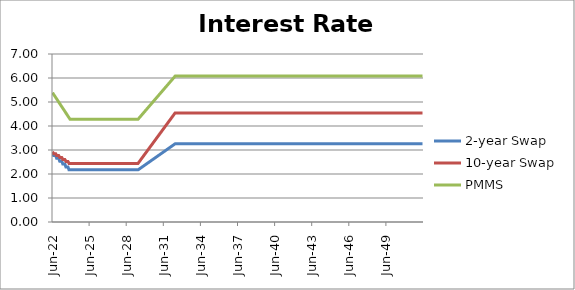
| Category | 2-year Swap | 10-year Swap | PMMS |
|---|---|---|---|
| 2022-06-30 | 2.894 | 2.93 | 5.39 |
| 2022-07-31 | 2.774 | 2.849 | 5.325 |
| 2022-08-31 | 2.774 | 2.849 | 5.259 |
| 2022-09-30 | 2.774 | 2.849 | 5.194 |
| 2022-10-31 | 2.653 | 2.767 | 5.129 |
| 2022-11-30 | 2.653 | 2.767 | 5.064 |
| 2022-12-31 | 2.653 | 2.767 | 4.999 |
| 2023-01-31 | 2.533 | 2.686 | 4.934 |
| 2023-02-28 | 2.533 | 2.686 | 4.868 |
| 2023-03-31 | 2.533 | 2.686 | 4.803 |
| 2023-04-30 | 2.413 | 2.605 | 4.738 |
| 2023-05-31 | 2.413 | 2.605 | 4.673 |
| 2023-06-30 | 2.413 | 2.605 | 4.608 |
| 2023-07-31 | 2.293 | 2.523 | 4.542 |
| 2023-08-31 | 2.293 | 2.523 | 4.477 |
| 2023-09-30 | 2.293 | 2.523 | 4.412 |
| 2023-10-31 | 2.172 | 2.442 | 4.347 |
| 2023-11-30 | 2.172 | 2.442 | 4.282 |
| 2023-12-31 | 2.172 | 2.442 | 4.282 |
| 2024-01-31 | 2.172 | 2.442 | 4.282 |
| 2024-02-29 | 2.172 | 2.442 | 4.282 |
| 2024-03-31 | 2.172 | 2.442 | 4.282 |
| 2024-04-30 | 2.172 | 2.442 | 4.282 |
| 2024-05-31 | 2.172 | 2.442 | 4.282 |
| 2024-06-30 | 2.172 | 2.442 | 4.282 |
| 2024-07-31 | 2.172 | 2.442 | 4.282 |
| 2024-08-31 | 2.172 | 2.442 | 4.282 |
| 2024-09-30 | 2.172 | 2.442 | 4.282 |
| 2024-10-31 | 2.172 | 2.442 | 4.282 |
| 2024-11-30 | 2.172 | 2.442 | 4.282 |
| 2024-12-31 | 2.172 | 2.442 | 4.282 |
| 2025-01-31 | 2.172 | 2.442 | 4.282 |
| 2025-02-28 | 2.172 | 2.442 | 4.282 |
| 2025-03-31 | 2.172 | 2.442 | 4.282 |
| 2025-04-30 | 2.172 | 2.442 | 4.282 |
| 2025-05-31 | 2.172 | 2.442 | 4.282 |
| 2025-06-30 | 2.172 | 2.442 | 4.282 |
| 2025-07-31 | 2.172 | 2.442 | 4.282 |
| 2025-08-31 | 2.172 | 2.442 | 4.282 |
| 2025-09-30 | 2.172 | 2.442 | 4.282 |
| 2025-10-31 | 2.172 | 2.442 | 4.282 |
| 2025-11-30 | 2.172 | 2.442 | 4.282 |
| 2025-12-31 | 2.172 | 2.442 | 4.282 |
| 2026-01-31 | 2.172 | 2.442 | 4.282 |
| 2026-02-28 | 2.172 | 2.442 | 4.282 |
| 2026-03-31 | 2.172 | 2.442 | 4.282 |
| 2026-04-30 | 2.172 | 2.442 | 4.282 |
| 2026-05-31 | 2.172 | 2.442 | 4.282 |
| 2026-06-30 | 2.172 | 2.442 | 4.282 |
| 2026-07-31 | 2.172 | 2.442 | 4.282 |
| 2026-08-31 | 2.172 | 2.442 | 4.282 |
| 2026-09-30 | 2.172 | 2.442 | 4.282 |
| 2026-10-31 | 2.172 | 2.442 | 4.282 |
| 2026-11-30 | 2.172 | 2.442 | 4.282 |
| 2026-12-31 | 2.172 | 2.442 | 4.282 |
| 2027-01-31 | 2.172 | 2.442 | 4.282 |
| 2027-02-28 | 2.172 | 2.442 | 4.282 |
| 2027-03-31 | 2.172 | 2.442 | 4.282 |
| 2027-04-30 | 2.172 | 2.442 | 4.282 |
| 2027-05-31 | 2.172 | 2.442 | 4.282 |
| 2027-06-30 | 2.172 | 2.442 | 4.282 |
| 2027-07-31 | 2.172 | 2.442 | 4.282 |
| 2027-08-31 | 2.172 | 2.442 | 4.282 |
| 2027-09-30 | 2.172 | 2.442 | 4.282 |
| 2027-10-31 | 2.172 | 2.442 | 4.282 |
| 2027-11-30 | 2.172 | 2.442 | 4.282 |
| 2027-12-31 | 2.172 | 2.442 | 4.282 |
| 2028-01-31 | 2.172 | 2.442 | 4.282 |
| 2028-02-29 | 2.172 | 2.442 | 4.282 |
| 2028-03-31 | 2.172 | 2.442 | 4.282 |
| 2028-04-30 | 2.172 | 2.442 | 4.282 |
| 2028-05-31 | 2.172 | 2.442 | 4.282 |
| 2028-06-30 | 2.172 | 2.442 | 4.282 |
| 2028-07-31 | 2.172 | 2.442 | 4.282 |
| 2028-08-31 | 2.172 | 2.442 | 4.282 |
| 2028-09-30 | 2.172 | 2.442 | 4.282 |
| 2028-10-31 | 2.172 | 2.442 | 4.282 |
| 2028-11-30 | 2.172 | 2.442 | 4.282 |
| 2028-12-31 | 2.172 | 2.442 | 4.282 |
| 2029-01-31 | 2.172 | 2.442 | 4.282 |
| 2029-02-28 | 2.172 | 2.442 | 4.282 |
| 2029-03-31 | 2.172 | 2.442 | 4.282 |
| 2029-04-30 | 2.172 | 2.442 | 4.282 |
| 2029-05-31 | 2.172 | 2.442 | 4.282 |
| 2029-06-30 | 2.203 | 2.5 | 4.332 |
| 2029-07-31 | 2.233 | 2.559 | 4.382 |
| 2029-08-31 | 2.263 | 2.617 | 4.431 |
| 2029-09-30 | 2.293 | 2.676 | 4.481 |
| 2029-10-31 | 2.323 | 2.734 | 4.531 |
| 2029-11-30 | 2.354 | 2.793 | 4.581 |
| 2029-12-31 | 2.384 | 2.851 | 4.631 |
| 2030-01-31 | 2.414 | 2.91 | 4.681 |
| 2030-02-28 | 2.444 | 2.968 | 4.731 |
| 2030-03-31 | 2.474 | 3.026 | 4.781 |
| 2030-04-30 | 2.505 | 3.085 | 4.831 |
| 2030-05-31 | 2.535 | 3.143 | 4.881 |
| 2030-06-30 | 2.565 | 3.202 | 4.931 |
| 2030-07-31 | 2.595 | 3.26 | 4.981 |
| 2030-08-31 | 2.625 | 3.319 | 5.031 |
| 2030-09-30 | 2.655 | 3.377 | 5.081 |
| 2030-10-31 | 2.686 | 3.436 | 5.13 |
| 2030-11-30 | 2.716 | 3.494 | 5.18 |
| 2030-12-31 | 2.746 | 3.552 | 5.23 |
| 2031-01-31 | 2.776 | 3.611 | 5.28 |
| 2031-02-28 | 2.806 | 3.669 | 5.33 |
| 2031-03-31 | 2.837 | 3.728 | 5.38 |
| 2031-04-30 | 2.867 | 3.786 | 5.43 |
| 2031-05-31 | 2.897 | 3.845 | 5.48 |
| 2031-06-30 | 2.927 | 3.903 | 5.53 |
| 2031-07-31 | 2.957 | 3.962 | 5.58 |
| 2031-08-31 | 2.988 | 4.02 | 5.63 |
| 2031-09-30 | 3.018 | 4.078 | 5.68 |
| 2031-10-31 | 3.048 | 4.137 | 5.73 |
| 2031-11-30 | 3.078 | 4.195 | 5.779 |
| 2031-12-31 | 3.108 | 4.254 | 5.829 |
| 2032-01-31 | 3.139 | 4.312 | 5.879 |
| 2032-02-29 | 3.169 | 4.371 | 5.929 |
| 2032-03-31 | 3.199 | 4.429 | 5.979 |
| 2032-04-30 | 3.229 | 4.488 | 6.029 |
| 2032-05-31 | 3.259 | 4.546 | 6.079 |
| 2032-06-30 | 3.259 | 4.546 | 6.079 |
| 2032-07-31 | 3.259 | 4.546 | 6.079 |
| 2032-08-31 | 3.259 | 4.546 | 6.079 |
| 2032-09-30 | 3.259 | 4.546 | 6.079 |
| 2032-10-31 | 3.259 | 4.546 | 6.079 |
| 2032-11-30 | 3.259 | 4.546 | 6.079 |
| 2032-12-31 | 3.259 | 4.546 | 6.079 |
| 2033-01-31 | 3.259 | 4.546 | 6.079 |
| 2033-02-28 | 3.259 | 4.546 | 6.079 |
| 2033-03-31 | 3.259 | 4.546 | 6.079 |
| 2033-04-30 | 3.259 | 4.546 | 6.079 |
| 2033-05-31 | 3.259 | 4.546 | 6.079 |
| 2033-06-30 | 3.259 | 4.546 | 6.079 |
| 2033-07-31 | 3.259 | 4.546 | 6.079 |
| 2033-08-31 | 3.259 | 4.546 | 6.079 |
| 2033-09-30 | 3.259 | 4.546 | 6.079 |
| 2033-10-31 | 3.259 | 4.546 | 6.079 |
| 2033-11-30 | 3.259 | 4.546 | 6.079 |
| 2033-12-31 | 3.259 | 4.546 | 6.079 |
| 2034-01-31 | 3.259 | 4.546 | 6.079 |
| 2034-02-28 | 3.259 | 4.546 | 6.079 |
| 2034-03-31 | 3.259 | 4.546 | 6.079 |
| 2034-04-30 | 3.259 | 4.546 | 6.079 |
| 2034-05-31 | 3.259 | 4.546 | 6.079 |
| 2034-06-30 | 3.259 | 4.546 | 6.079 |
| 2034-07-31 | 3.259 | 4.546 | 6.079 |
| 2034-08-31 | 3.259 | 4.546 | 6.079 |
| 2034-09-30 | 3.259 | 4.546 | 6.079 |
| 2034-10-31 | 3.259 | 4.546 | 6.079 |
| 2034-11-30 | 3.259 | 4.546 | 6.079 |
| 2034-12-31 | 3.259 | 4.546 | 6.079 |
| 2035-01-31 | 3.259 | 4.546 | 6.079 |
| 2035-02-28 | 3.259 | 4.546 | 6.079 |
| 2035-03-31 | 3.259 | 4.546 | 6.079 |
| 2035-04-30 | 3.259 | 4.546 | 6.079 |
| 2035-05-31 | 3.259 | 4.546 | 6.079 |
| 2035-06-30 | 3.259 | 4.546 | 6.079 |
| 2035-07-31 | 3.259 | 4.546 | 6.079 |
| 2035-08-31 | 3.259 | 4.546 | 6.079 |
| 2035-09-30 | 3.259 | 4.546 | 6.079 |
| 2035-10-31 | 3.259 | 4.546 | 6.079 |
| 2035-11-30 | 3.259 | 4.546 | 6.079 |
| 2035-12-31 | 3.259 | 4.546 | 6.079 |
| 2036-01-31 | 3.259 | 4.546 | 6.079 |
| 2036-02-29 | 3.259 | 4.546 | 6.079 |
| 2036-03-31 | 3.259 | 4.546 | 6.079 |
| 2036-04-30 | 3.259 | 4.546 | 6.079 |
| 2036-05-31 | 3.259 | 4.546 | 6.079 |
| 2036-06-30 | 3.259 | 4.546 | 6.079 |
| 2036-07-31 | 3.259 | 4.546 | 6.079 |
| 2036-08-31 | 3.259 | 4.546 | 6.079 |
| 2036-09-30 | 3.259 | 4.546 | 6.079 |
| 2036-10-31 | 3.259 | 4.546 | 6.079 |
| 2036-11-30 | 3.259 | 4.546 | 6.079 |
| 2036-12-31 | 3.259 | 4.546 | 6.079 |
| 2037-01-31 | 3.259 | 4.546 | 6.079 |
| 2037-02-28 | 3.259 | 4.546 | 6.079 |
| 2037-03-31 | 3.259 | 4.546 | 6.079 |
| 2037-04-30 | 3.259 | 4.546 | 6.079 |
| 2037-05-31 | 3.259 | 4.546 | 6.079 |
| 2037-06-30 | 3.259 | 4.546 | 6.079 |
| 2037-07-31 | 3.259 | 4.546 | 6.079 |
| 2037-08-31 | 3.259 | 4.546 | 6.079 |
| 2037-09-30 | 3.259 | 4.546 | 6.079 |
| 2037-10-31 | 3.259 | 4.546 | 6.079 |
| 2037-11-30 | 3.259 | 4.546 | 6.079 |
| 2037-12-31 | 3.259 | 4.546 | 6.079 |
| 2038-01-31 | 3.259 | 4.546 | 6.079 |
| 2038-02-28 | 3.259 | 4.546 | 6.079 |
| 2038-03-31 | 3.259 | 4.546 | 6.079 |
| 2038-04-30 | 3.259 | 4.546 | 6.079 |
| 2038-05-31 | 3.259 | 4.546 | 6.079 |
| 2038-06-30 | 3.259 | 4.546 | 6.079 |
| 2038-07-31 | 3.259 | 4.546 | 6.079 |
| 2038-08-31 | 3.259 | 4.546 | 6.079 |
| 2038-09-30 | 3.259 | 4.546 | 6.079 |
| 2038-10-31 | 3.259 | 4.546 | 6.079 |
| 2038-11-30 | 3.259 | 4.546 | 6.079 |
| 2038-12-31 | 3.259 | 4.546 | 6.079 |
| 2039-01-31 | 3.259 | 4.546 | 6.079 |
| 2039-02-28 | 3.259 | 4.546 | 6.079 |
| 2039-03-31 | 3.259 | 4.546 | 6.079 |
| 2039-04-30 | 3.259 | 4.546 | 6.079 |
| 2039-05-31 | 3.259 | 4.546 | 6.079 |
| 2039-06-30 | 3.259 | 4.546 | 6.079 |
| 2039-07-31 | 3.259 | 4.546 | 6.079 |
| 2039-08-31 | 3.259 | 4.546 | 6.079 |
| 2039-09-30 | 3.259 | 4.546 | 6.079 |
| 2039-10-31 | 3.259 | 4.546 | 6.079 |
| 2039-11-30 | 3.259 | 4.546 | 6.079 |
| 2039-12-31 | 3.259 | 4.546 | 6.079 |
| 2040-01-31 | 3.259 | 4.546 | 6.079 |
| 2040-02-29 | 3.259 | 4.546 | 6.079 |
| 2040-03-31 | 3.259 | 4.546 | 6.079 |
| 2040-04-30 | 3.259 | 4.546 | 6.079 |
| 2040-05-31 | 3.259 | 4.546 | 6.079 |
| 2040-06-30 | 3.259 | 4.546 | 6.079 |
| 2040-07-31 | 3.259 | 4.546 | 6.079 |
| 2040-08-31 | 3.259 | 4.546 | 6.079 |
| 2040-09-30 | 3.259 | 4.546 | 6.079 |
| 2040-10-31 | 3.259 | 4.546 | 6.079 |
| 2040-11-30 | 3.259 | 4.546 | 6.079 |
| 2040-12-31 | 3.259 | 4.546 | 6.079 |
| 2041-01-31 | 3.259 | 4.546 | 6.079 |
| 2041-02-28 | 3.259 | 4.546 | 6.079 |
| 2041-03-31 | 3.259 | 4.546 | 6.079 |
| 2041-04-30 | 3.259 | 4.546 | 6.079 |
| 2041-05-31 | 3.259 | 4.546 | 6.079 |
| 2041-06-30 | 3.259 | 4.546 | 6.079 |
| 2041-07-31 | 3.259 | 4.546 | 6.079 |
| 2041-08-31 | 3.259 | 4.546 | 6.079 |
| 2041-09-30 | 3.259 | 4.546 | 6.079 |
| 2041-10-31 | 3.259 | 4.546 | 6.079 |
| 2041-11-30 | 3.259 | 4.546 | 6.079 |
| 2041-12-31 | 3.259 | 4.546 | 6.079 |
| 2042-01-31 | 3.259 | 4.546 | 6.079 |
| 2042-02-28 | 3.259 | 4.546 | 6.079 |
| 2042-03-31 | 3.259 | 4.546 | 6.079 |
| 2042-04-30 | 3.259 | 4.546 | 6.079 |
| 2042-05-31 | 3.259 | 4.546 | 6.079 |
| 2042-06-30 | 3.259 | 4.546 | 6.079 |
| 2042-07-31 | 3.259 | 4.546 | 6.079 |
| 2042-08-31 | 3.259 | 4.546 | 6.079 |
| 2042-09-30 | 3.259 | 4.546 | 6.079 |
| 2042-10-31 | 3.259 | 4.546 | 6.079 |
| 2042-11-30 | 3.259 | 4.546 | 6.079 |
| 2042-12-31 | 3.259 | 4.546 | 6.079 |
| 2043-01-31 | 3.259 | 4.546 | 6.079 |
| 2043-02-28 | 3.259 | 4.546 | 6.079 |
| 2043-03-31 | 3.259 | 4.546 | 6.079 |
| 2043-04-30 | 3.259 | 4.546 | 6.079 |
| 2043-05-31 | 3.259 | 4.546 | 6.079 |
| 2043-06-30 | 3.259 | 4.546 | 6.079 |
| 2043-07-31 | 3.259 | 4.546 | 6.079 |
| 2043-08-31 | 3.259 | 4.546 | 6.079 |
| 2043-09-30 | 3.259 | 4.546 | 6.079 |
| 2043-10-31 | 3.259 | 4.546 | 6.079 |
| 2043-11-30 | 3.259 | 4.546 | 6.079 |
| 2043-12-31 | 3.259 | 4.546 | 6.079 |
| 2044-01-31 | 3.259 | 4.546 | 6.079 |
| 2044-02-29 | 3.259 | 4.546 | 6.079 |
| 2044-03-31 | 3.259 | 4.546 | 6.079 |
| 2044-04-30 | 3.259 | 4.546 | 6.079 |
| 2044-05-31 | 3.259 | 4.546 | 6.079 |
| 2044-06-30 | 3.259 | 4.546 | 6.079 |
| 2044-07-31 | 3.259 | 4.546 | 6.079 |
| 2044-08-31 | 3.259 | 4.546 | 6.079 |
| 2044-09-30 | 3.259 | 4.546 | 6.079 |
| 2044-10-31 | 3.259 | 4.546 | 6.079 |
| 2044-11-30 | 3.259 | 4.546 | 6.079 |
| 2044-12-31 | 3.259 | 4.546 | 6.079 |
| 2045-01-31 | 3.259 | 4.546 | 6.079 |
| 2045-02-28 | 3.259 | 4.546 | 6.079 |
| 2045-03-31 | 3.259 | 4.546 | 6.079 |
| 2045-04-30 | 3.259 | 4.546 | 6.079 |
| 2045-05-31 | 3.259 | 4.546 | 6.079 |
| 2045-06-30 | 3.259 | 4.546 | 6.079 |
| 2045-07-31 | 3.259 | 4.546 | 6.079 |
| 2045-08-31 | 3.259 | 4.546 | 6.079 |
| 2045-09-30 | 3.259 | 4.546 | 6.079 |
| 2045-10-31 | 3.259 | 4.546 | 6.079 |
| 2045-11-30 | 3.259 | 4.546 | 6.079 |
| 2045-12-31 | 3.259 | 4.546 | 6.079 |
| 2046-01-31 | 3.259 | 4.546 | 6.079 |
| 2046-02-28 | 3.259 | 4.546 | 6.079 |
| 2046-03-31 | 3.259 | 4.546 | 6.079 |
| 2046-04-30 | 3.259 | 4.546 | 6.079 |
| 2046-05-31 | 3.259 | 4.546 | 6.079 |
| 2046-06-30 | 3.259 | 4.546 | 6.079 |
| 2046-07-31 | 3.259 | 4.546 | 6.079 |
| 2046-08-31 | 3.259 | 4.546 | 6.079 |
| 2046-09-30 | 3.259 | 4.546 | 6.079 |
| 2046-10-31 | 3.259 | 4.546 | 6.079 |
| 2046-11-30 | 3.259 | 4.546 | 6.079 |
| 2046-12-31 | 3.259 | 4.546 | 6.079 |
| 2047-01-31 | 3.259 | 4.546 | 6.079 |
| 2047-02-28 | 3.259 | 4.546 | 6.079 |
| 2047-03-31 | 3.259 | 4.546 | 6.079 |
| 2047-04-30 | 3.259 | 4.546 | 6.079 |
| 2047-05-31 | 3.259 | 4.546 | 6.079 |
| 2047-06-30 | 3.259 | 4.546 | 6.079 |
| 2047-07-31 | 3.259 | 4.546 | 6.079 |
| 2047-08-31 | 3.259 | 4.546 | 6.079 |
| 2047-09-30 | 3.259 | 4.546 | 6.079 |
| 2047-10-31 | 3.259 | 4.546 | 6.079 |
| 2047-11-30 | 3.259 | 4.546 | 6.079 |
| 2047-12-31 | 3.259 | 4.546 | 6.079 |
| 2048-01-31 | 3.259 | 4.546 | 6.079 |
| 2048-02-29 | 3.259 | 4.546 | 6.079 |
| 2048-03-31 | 3.259 | 4.546 | 6.079 |
| 2048-04-30 | 3.259 | 4.546 | 6.079 |
| 2048-05-31 | 3.259 | 4.546 | 6.079 |
| 2048-06-30 | 3.259 | 4.546 | 6.079 |
| 2048-07-31 | 3.259 | 4.546 | 6.079 |
| 2048-08-31 | 3.259 | 4.546 | 6.079 |
| 2048-09-30 | 3.259 | 4.546 | 6.079 |
| 2048-10-31 | 3.259 | 4.546 | 6.079 |
| 2048-11-30 | 3.259 | 4.546 | 6.079 |
| 2048-12-31 | 3.259 | 4.546 | 6.079 |
| 2049-01-31 | 3.259 | 4.546 | 6.079 |
| 2049-02-28 | 3.259 | 4.546 | 6.079 |
| 2049-03-31 | 3.259 | 4.546 | 6.079 |
| 2049-04-30 | 3.259 | 4.546 | 6.079 |
| 2049-05-31 | 3.259 | 4.546 | 6.079 |
| 2049-06-30 | 3.259 | 4.546 | 6.079 |
| 2049-07-31 | 3.259 | 4.546 | 6.079 |
| 2049-08-31 | 3.259 | 4.546 | 6.079 |
| 2049-09-30 | 3.259 | 4.546 | 6.079 |
| 2049-10-31 | 3.259 | 4.546 | 6.079 |
| 2049-11-30 | 3.259 | 4.546 | 6.079 |
| 2049-12-31 | 3.259 | 4.546 | 6.079 |
| 2050-01-31 | 3.259 | 4.546 | 6.079 |
| 2050-02-28 | 3.259 | 4.546 | 6.079 |
| 2050-03-31 | 3.259 | 4.546 | 6.079 |
| 2050-04-30 | 3.259 | 4.546 | 6.079 |
| 2050-05-31 | 3.259 | 4.546 | 6.079 |
| 2050-06-30 | 3.259 | 4.546 | 6.079 |
| 2050-07-31 | 3.259 | 4.546 | 6.079 |
| 2050-08-31 | 3.259 | 4.546 | 6.079 |
| 2050-09-30 | 3.259 | 4.546 | 6.079 |
| 2050-10-31 | 3.259 | 4.546 | 6.079 |
| 2050-11-30 | 3.259 | 4.546 | 6.079 |
| 2050-12-31 | 3.259 | 4.546 | 6.079 |
| 2051-01-31 | 3.259 | 4.546 | 6.079 |
| 2051-02-28 | 3.259 | 4.546 | 6.079 |
| 2051-03-31 | 3.259 | 4.546 | 6.079 |
| 2051-04-30 | 3.259 | 4.546 | 6.079 |
| 2051-05-31 | 3.259 | 4.546 | 6.079 |
| 2051-06-30 | 3.259 | 4.546 | 6.079 |
| 2051-07-31 | 3.259 | 4.546 | 6.079 |
| 2051-08-31 | 3.259 | 4.546 | 6.079 |
| 2051-09-30 | 3.259 | 4.546 | 6.079 |
| 2051-10-31 | 3.259 | 4.546 | 6.079 |
| 2051-11-30 | 3.259 | 4.546 | 6.079 |
| 2051-12-31 | 3.259 | 4.546 | 6.079 |
| 2052-01-31 | 3.259 | 4.546 | 6.079 |
| 2052-02-29 | 3.259 | 4.546 | 6.079 |
| 2052-03-31 | 3.259 | 4.546 | 6.079 |
| 2052-04-30 | 3.259 | 4.546 | 6.079 |
| 2052-05-31 | 3.259 | 4.546 | 6.079 |